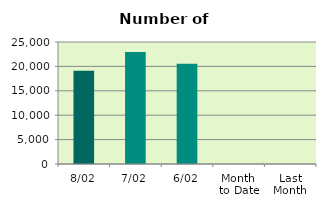
| Category | Series 0 |
|---|---|
| 8/02 | 19118 |
| 7/02 | 22930 |
| 6/02 | 20534 |
| Month 
to Date | 0 |
| Last
Month | 0 |